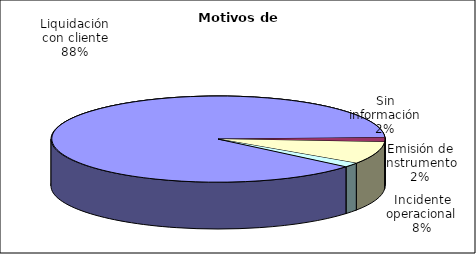
| Category | Motivos |
|---|---|
| Liquidación con cliente | 485 |
| Emisión de instrumento | 9 |
| Incidente operacional | 46 |
| Sin información | 9 |